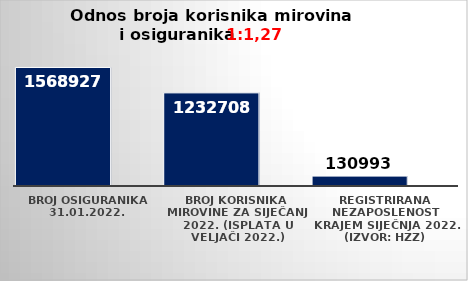
| Category | Series 0 | Series 1 |
|---|---|---|
| Broj osiguranika 31.01.2022.  | 1568927 |  |
| Broj korisnika mirovine za siječanj 2022. (isplata u veljači 2022.) | 1232708 |  |
| Registrirana nezaposlenost krajem siječnja 2022. (izvor: HZZ) | 130993 |  |